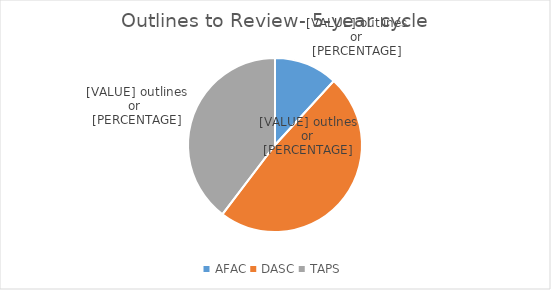
| Category | Series 0 |
|---|---|
| AFAC | 28 |
| DASC | 115 |
| TAPS | 94 |